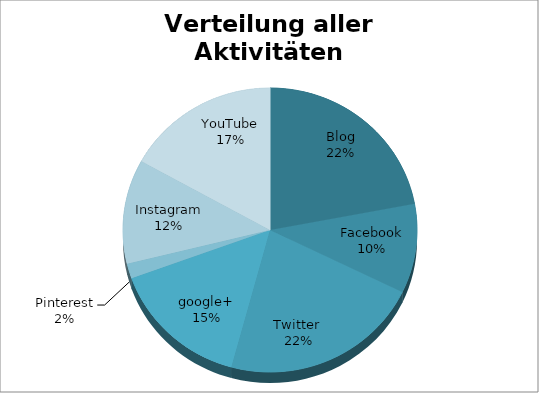
| Category | Series 0 |
|---|---|
| Blog | 13 |
| Facebook | 6 |
| Twitter  | 13 |
| google+ | 9 |
| Pinterest | 1 |
| Instagram | 7 |
| YouTube | 10 |